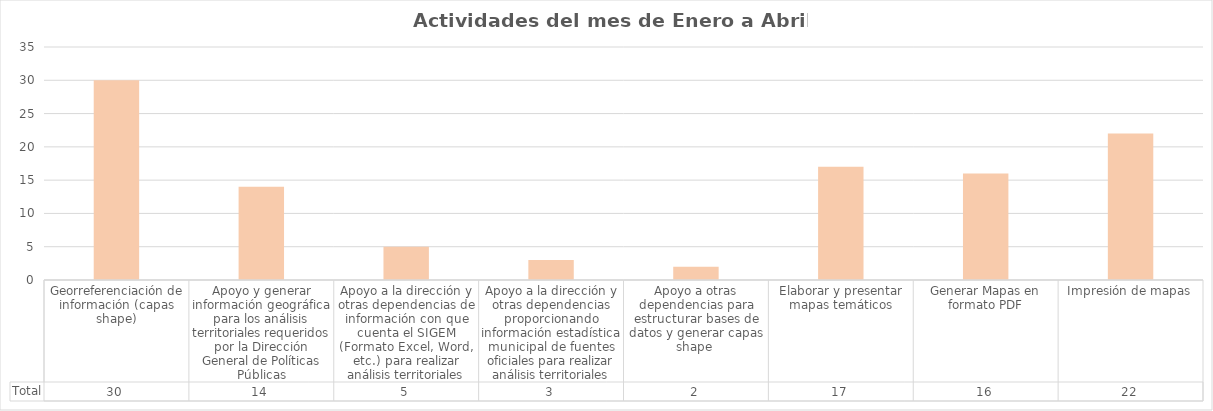
| Category | Total |
|---|---|
| Georreferenciación de información (capas shape) | 30 |
| Apoyo y generar información geográfica para los análisis territoriales requeridos por la Dirección General de Políticas Públicas | 14 |
| Apoyo a la dirección y otras dependencias de información con que cuenta el SIGEM (Formato Excel, Word, etc.) para realizar análisis territoriales | 5 |
| Apoyo a la dirección y otras dependencias proporcionando información estadística municipal de fuentes oficiales para realizar análisis territoriales | 3 |
| Apoyo a otras dependencias para estructurar bases de datos y generar capas shape  | 2 |
| Elaborar y presentar mapas temáticos | 17 |
| Generar Mapas en formato PDF | 16 |
| Impresión de mapas | 22 |